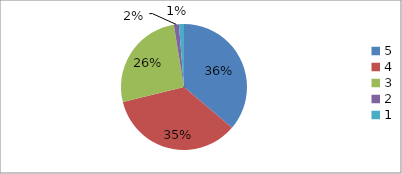
| Category | Series 0 | Series 1 |
|---|---|---|
| 5.0 | 36.3 | 36.3 |
| 4.0 | 35 | 35 |
| 3.0 | 26.3 | 26.3 |
| 2.0 | 1.3 | 1.3 |
| 1.0 | 1.3 | 1.3 |